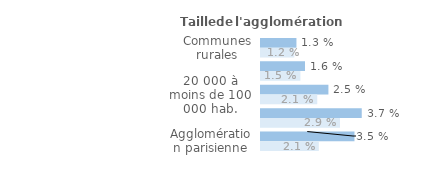
| Category | Series 1 | Series 0 |
|---|---|---|
| Communes rurales | 0.013 | 0.012 |
| Moins de 20 000 hab. | 0.016 | 0.015 |
| 20 000 à moins de 100 000 hab. | 0.025 | 0.021 |
| 100 000 hab. ou plus | 0.037 | 0.029 |
| Agglomération parisienne | 0.035 | 0.021 |